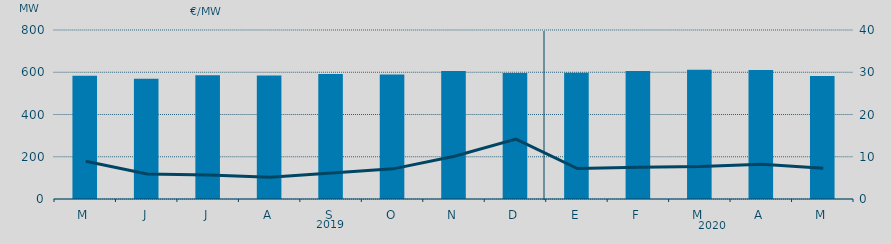
| Category | Energia (MWh) a subir |
|---|---|
| M | 583.379 |
| J | 569.496 |
| J | 585.727 |
| A | 584.609 |
| S | 591.64 |
| O | 589.349 |
| N | 605.422 |
| D | 596.999 |
| E | 597.488 |
| F | 605.632 |
| M | 611.351 |
| A | 610.483 |
| M | 582.745 |